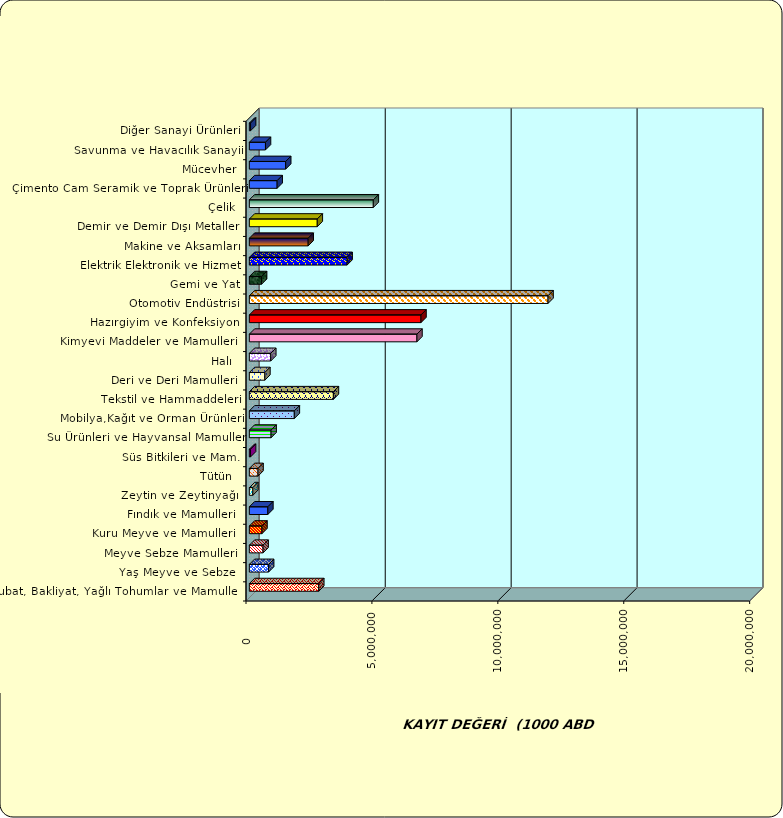
| Category | Series 0 |
|---|---|
|  Hububat, Bakliyat, Yağlı Tohumlar ve Mamulleri  | 2755487.198 |
|  Yaş Meyve ve Sebze   | 764645.874 |
|  Meyve Sebze Mamulleri  | 544700.36 |
|  Kuru Meyve ve Mamulleri   | 500441.315 |
|  Fındık ve Mamulleri  | 733952.27 |
|  Zeytin ve Zeytinyağı  | 138881.35 |
|  Tütün  | 344396.095 |
|  Süs Bitkileri ve Mam. | 47173.209 |
|  Su Ürünleri ve Hayvansal Mamuller | 863383.871 |
|  Mobilya,Kağıt ve Orman Ürünleri | 1785679.915 |
|  Tekstil ve Hammaddeleri | 3337363.579 |
|  Deri ve Deri Mamulleri  | 616337.595 |
|  Halı  | 849910.517 |
|  Kimyevi Maddeler ve Mamulleri   | 6655115.271 |
|  Hazırgiyim ve Konfeksiyon  | 6814802.15 |
|  Otomotiv Endüstrisi | 11860550.609 |
|  Gemi ve Yat | 484923.82 |
|  Elektrik Elektronik ve Hizmet | 3882286.935 |
|  Makine ve Aksamları | 2335801.183 |
|  Demir ve Demir Dışı Metaller  | 2697039.594 |
|  Çelik | 4922464.013 |
|  Çimento Cam Seramik ve Toprak Ürünleri | 1103737.798 |
|  Mücevher | 1442618.608 |
|  Savunma ve Havacılık Sanayii | 640369.329 |
|  Diğer Sanayi Ürünleri | 48339.645 |